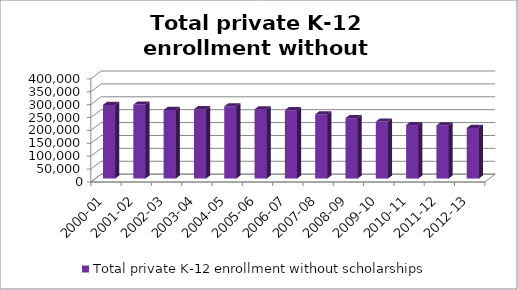
| Category | Total private K-12 enrollment without scholarships |
|---|---|
| 2000-01 | 285633 |
| 2001-02 | 286908 |
| 2002-03 | 266014 |
| 2003-04 | 269073 |
| 2004-05 | 280080 |
| 2005-06 | 268677 |
| 2006-07 | 265304 |
| 2007-08 | 249040 |
| 2008-09 | 234472 |
| 2009-10 | 221174 |
| 2010-11 | 207601 |
| 2011-12 | 206109 |
| 2012-13 | 196111 |